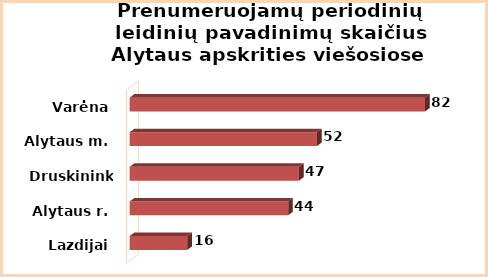
| Category | Series 0 |
|---|---|
| Lazdijai | 16 |
| Alytaus r. | 44 |
| Druskininkai | 47 |
| Alytaus m. | 52 |
| Varėna | 82 |